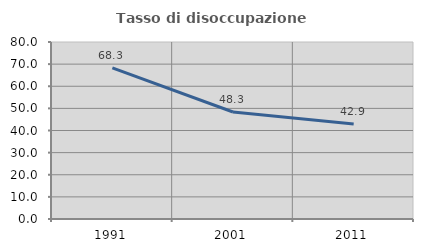
| Category | Tasso di disoccupazione giovanile  |
|---|---|
| 1991.0 | 68.3 |
| 2001.0 | 48.35 |
| 2011.0 | 42.918 |